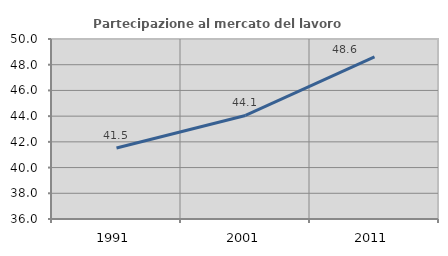
| Category | Partecipazione al mercato del lavoro  femminile |
|---|---|
| 1991.0 | 41.519 |
| 2001.0 | 44.054 |
| 2011.0 | 48.613 |